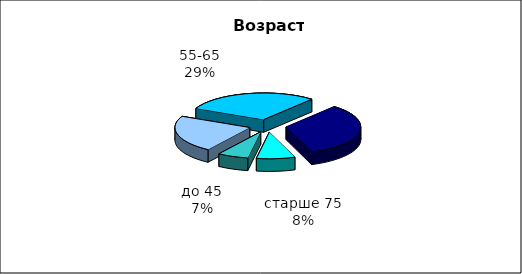
| Category | Series 0 |
|---|---|
| до 45 | 80 |
| 45-55 | 270 |
| 55-65 | 350 |
| 65-75 | 400 |
| старше 75 | 100 |